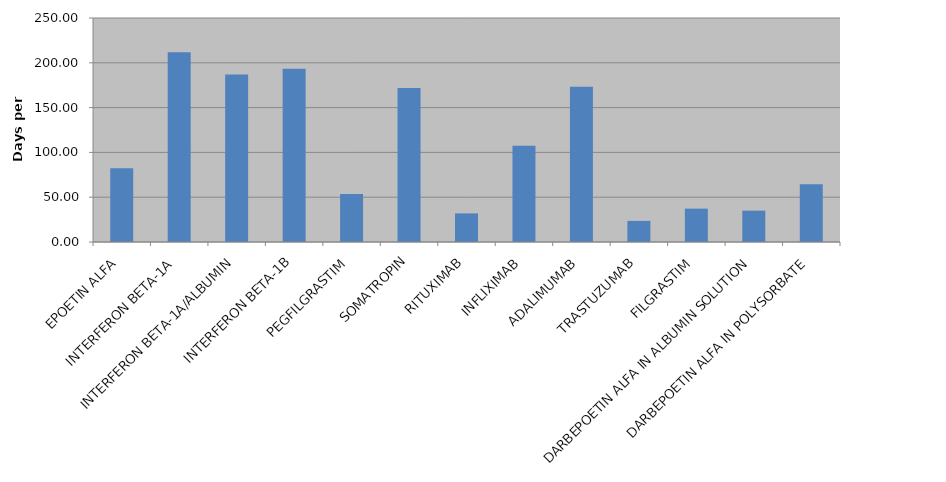
| Category | Total |
|---|---|
| EPOETIN ALFA | 82.317 |
| INTERFERON BETA-1A | 211.827 |
| INTERFERON BETA-1A/ALBUMIN | 187.029 |
| INTERFERON BETA-1B | 193.399 |
| PEGFILGRASTIM | 53.549 |
| SOMATROPIN | 171.748 |
| RITUXIMAB | 31.92 |
| INFLIXIMAB | 107.3 |
| ADALIMUMAB | 173.194 |
| TRASTUZUMAB | 23.565 |
| FILGRASTIM | 37.228 |
| DARBEPOETIN ALFA IN ALBUMIN SOLUTION | 35 |
| DARBEPOETIN ALFA IN POLYSORBATE | 64.577 |